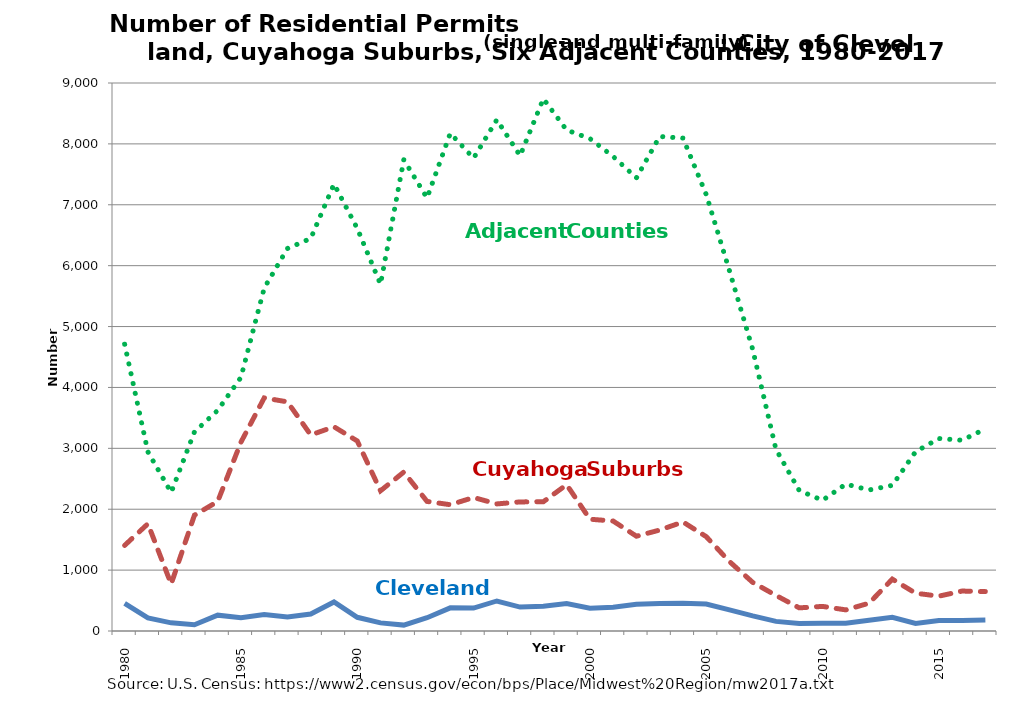
| Category | Adjacent Counties | Cuyahoga Suburbs | Cleveland |
|---|---|---|---|
| 1980.0 | 4710 | 1406 | 452 |
| nan | 2943 | 1761 | 215 |
| nan | 2276 | 771 | 134 |
| nan | 3269 | 1902 | 102 |
| nan | 3624 | 2127 | 260 |
| 1985.0 | 4166 | 3101 | 217 |
| nan | 5632 | 3828 | 272 |
| nan | 6282 | 3763 | 230 |
| nan | 6447 | 3220 | 279 |
| nan | 7341 | 3354 | 477 |
| 1990.0 | 6612 | 3121 | 225 |
| nan | 5694 | 2303 | 133 |
| nan | 7739 | 2610 | 97 |
| nan | 7113 | 2128 | 218 |
| nan | 8175 | 2074 | 380 |
| 1995.0 | 7765 | 2193 | 377 |
| nan | 8397 | 2087 | 493 |
| nan | 7805 | 2120 | 393 |
| nan | 8742 | 2123 | 406 |
| nan | 8227 | 2403 | 451 |
| 2000.0 | 8087 | 1836 | 373 |
| nan | 7793 | 1806 | 389 |
| nan | 7442 | 1557 | 439 |
| nan | 8122 | 1658 | 450 |
| nan | 8095 | 1791 | 457 |
| 2005.0 | 7169 | 1550 | 443 |
| nan | 5916 | 1140 | 347 |
| nan | 4623 | 798 | 248 |
| nan | 2982 | 584 | 158 |
| nan | 2307 | 380 | 123 |
| 2010.0 | 2146 | 404 | 127 |
| nan | 2413 | 347 | 129 |
| nan | 2316 | 457 | 177 |
| nan | 2392 | 852 | 226 |
| nan | 2944 | 621 | 124 |
| 2015.0 | 3161 | 572 | 172 |
| nan | 3133 | 656 | 173 |
| nan | 3320 | 647 | 180 |